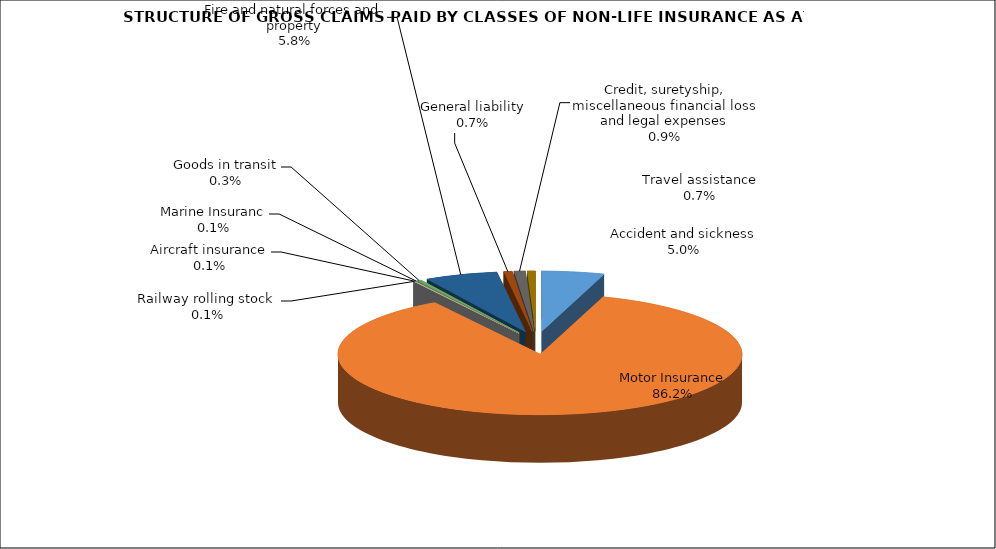
| Category | Accident and sickness |
|---|---|
| Accident and sickness | 0.05 |
| Motor Insurance | 0.862 |
| Railway rolling stock  | 0.001 |
| Aircraft insurance | 0.001 |
| Marine Insuranc | 0.001 |
| Goods in transit | 0.003 |
| Fire and natural forces and property | 0.058 |
| General liability | 0.007 |
| Credit, suretyship, miscellaneous financial loss and legal expenses | 0.009 |
| Travel assistance | 0.007 |